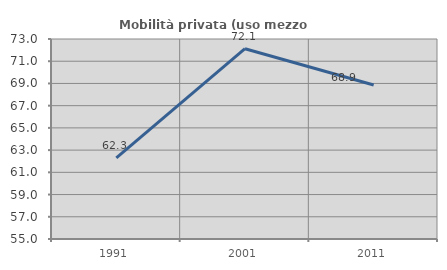
| Category | Mobilità privata (uso mezzo privato) |
|---|---|
| 1991.0 | 62.307 |
| 2001.0 | 72.126 |
| 2011.0 | 68.862 |